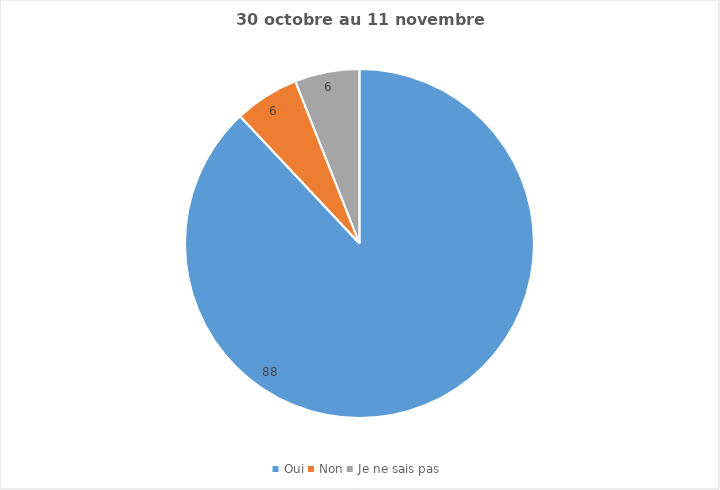
| Category | Series 0 |
|---|---|
| Oui | 88 |
| Non | 6 |
| Je ne sais pas | 6 |